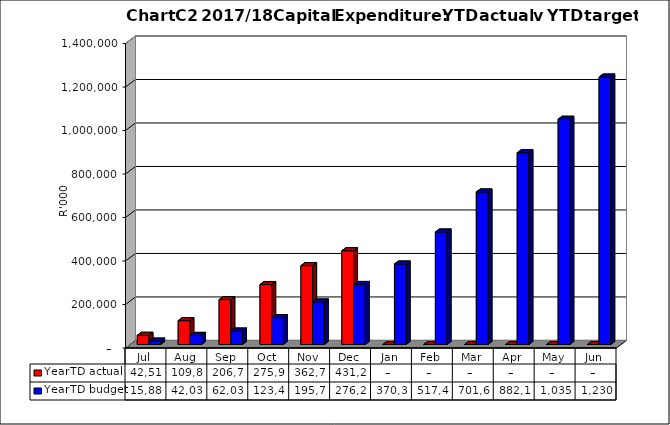
| Category | YearTD actual | YearTD budget |
|---|---|---|
| Jul | 42514077.958 | 15888227.121 |
| Aug | 109819163.669 | 42035272.322 |
| Sep | 206746264.689 | 62035272.322 |
| Oct | 275937386.544 | 123459362.725 |
| Nov | 362773276.763 | 195759882.867 |
| Dec | 431298740.768 | 276210403.008 |
| Jan | 0 | 370327465.529 |
| Feb | 0 | 517445513.065 |
| Mar | 0 | 701612575.586 |
| Apr | 0 | 882132384.943 |
| May | 0 | 1035958624.038 |
| Jun | 0 | 1230118000 |